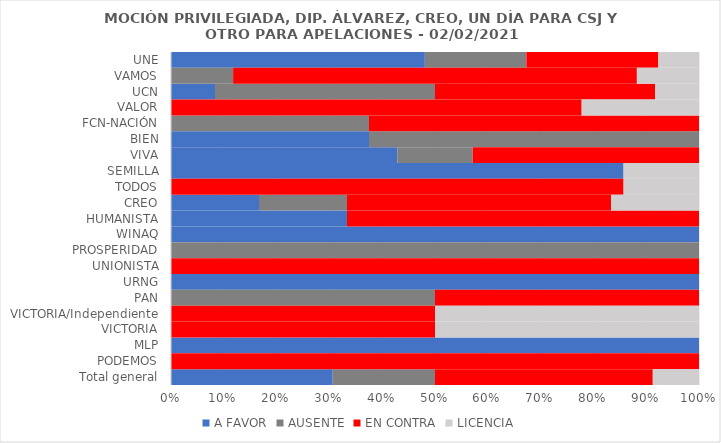
| Category | A FAVOR | AUSENTE | EN CONTRA | LICENCIA |
|---|---|---|---|---|
| UNE | 0.481 | 0.192 | 0.25 | 0.077 |
| VAMOS | 0 | 0.118 | 0.765 | 0.118 |
| UCN | 0.083 | 0.417 | 0.417 | 0.083 |
| VALOR | 0 | 0 | 0.778 | 0.222 |
| FCN-NACIÓN | 0 | 0.375 | 0.625 | 0 |
| BIEN | 0.375 | 0.625 | 0 | 0 |
| VIVA | 0.429 | 0.143 | 0.429 | 0 |
| SEMILLA | 0.857 | 0 | 0 | 0.143 |
| TODOS | 0 | 0 | 0.857 | 0.143 |
| CREO | 0.167 | 0.167 | 0.5 | 0.167 |
| HUMANISTA | 0.333 | 0 | 0.667 | 0 |
| WINAQ | 1 | 0 | 0 | 0 |
| PROSPERIDAD | 0 | 1 | 0 | 0 |
| UNIONISTA | 0 | 0 | 1 | 0 |
| URNG | 1 | 0 | 0 | 0 |
| PAN | 0 | 0.5 | 0.5 | 0 |
| VICTORIA/Independiente | 0 | 0 | 0.5 | 0.5 |
| VICTORIA | 0 | 0 | 0.5 | 0.5 |
| MLP | 1 | 0 | 0 | 0 |
| PODEMOS | 0 | 0 | 1 | 0 |
| Total general | 0.306 | 0.194 | 0.412 | 0.088 |